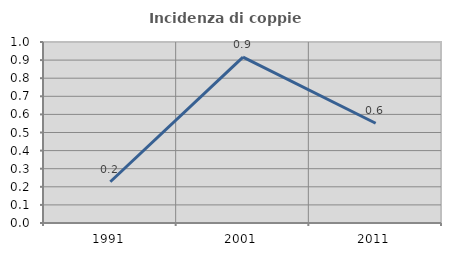
| Category | Incidenza di coppie miste |
|---|---|
| 1991.0 | 0.228 |
| 2001.0 | 0.916 |
| 2011.0 | 0.551 |